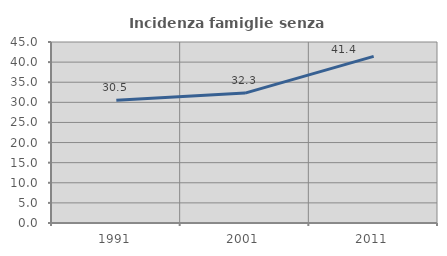
| Category | Incidenza famiglie senza nuclei |
|---|---|
| 1991.0 | 30.499 |
| 2001.0 | 32.292 |
| 2011.0 | 41.421 |